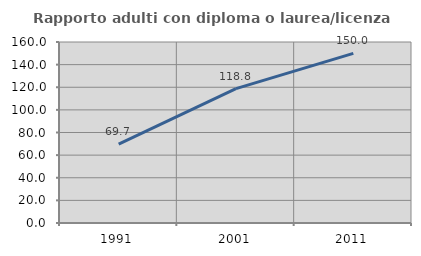
| Category | Rapporto adulti con diploma o laurea/licenza media  |
|---|---|
| 1991.0 | 69.708 |
| 2001.0 | 118.777 |
| 2011.0 | 150 |